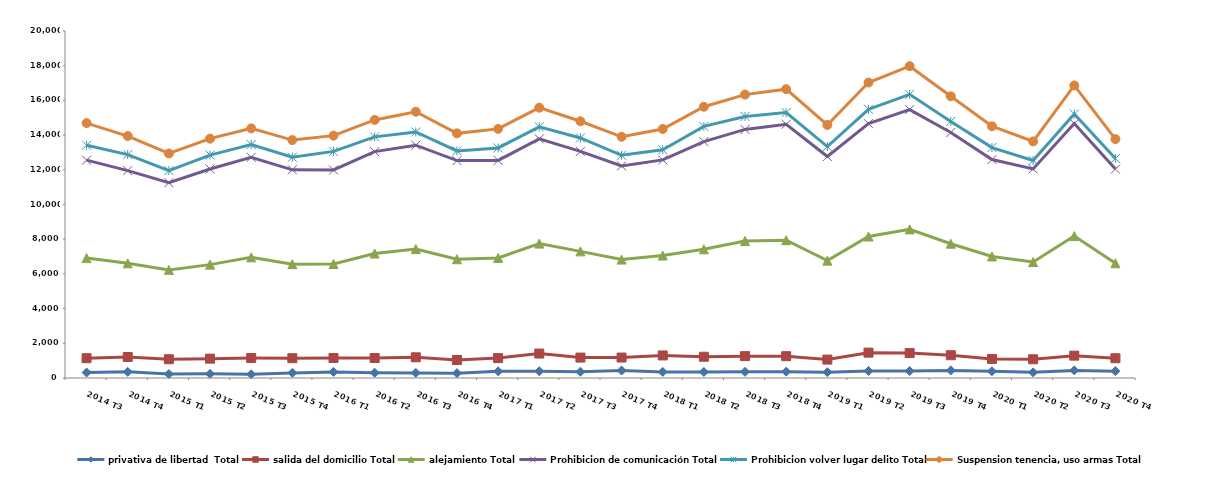
| Category | privativa de libertad  Total | salida del domicilio Total | alejamiento Total | Prohibicion de comunicación Total | Prohibicion volver lugar delito Total | Suspension tenencia, uso armas Total |
|---|---|---|---|---|---|---|
| 2014 T3 | 317 | 824 | 5769 | 5646 | 860 | 1275 |
| 2014 T4 | 355 | 855 | 5398 | 5347 | 923 | 1068 |
| 2015 T1 | 229 | 853 | 5150 | 5026 | 695 | 988 |
| 2015 T2 | 238 | 877 | 5419 | 5513 | 802 | 948 |
| 2015 T3 | 216 | 937 | 5800 | 5766 | 739 | 929 |
| 2015 T4 | 295 | 846 | 5420 | 5437 | 727 | 988 |
| 2016 T1 | 351 | 803 | 5416 | 5420 | 1072 | 908 |
| 2016 T2 | 306 | 846 | 6022 | 5873 | 852 | 975 |
| 2016 T3 | 295 | 898 | 6241 | 5985 | 762 | 1166 |
| 2016 T4 | 280 | 757 | 5807 | 5686 | 560 | 1010 |
| 2017 T1 | 385 | 763 | 5769 | 5625 | 720 | 1097 |
| 2017 T2 | 389 | 1020 | 6337 | 6036 | 695 | 1103 |
| 2017 T3 | 360 | 817 | 6122 | 5765 | 770 | 963 |
| 2017 T4 | 432 | 747 | 5646 | 5399 | 610 | 1069 |
| 2018 T1 | 350 | 950 | 5758 | 5513 | 585 | 1196 |
| 2018 T2 | 352 | 872 | 6194 | 6206 | 877 | 1133 |
| 2018 T3 | 354 | 906 | 6638 | 6430 | 743 | 1263 |
| 2018 T4 | 364 | 894 | 6685 | 6685 | 670 | 1349 |
| 2019 T1 | 334 | 727 | 5704 | 6003 | 573 | 1243 |
| 2019 T2 | 406 | 1055 | 6694 | 6504 | 827 | 1543 |
| 2019 T3 | 401 | 1035 | 7130 | 6902 | 880 | 1624 |
| 2019 T4 | 437 | 876 | 6426 | 6409 | 640 | 1450 |
| 2020 T1 | 387 | 713 | 5904 | 5586 | 692 | 1228 |
| 2020 T2 | 325 | 755 | 5603 | 5367 | 488 | 1099 |
| 2020 T3 | 437 | 852 | 6890 | 6487 | 545 | 1652 |
| 2020 T4 | 395 | 744 | 5474 | 5429 | 606 | 1122 |